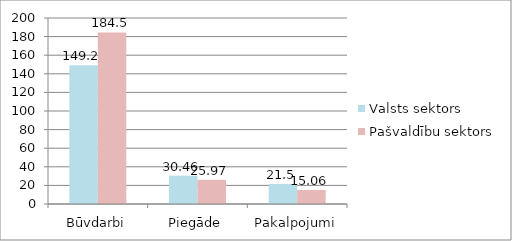
| Category | Valsts sektors | Pašvaldību sektors |
|---|---|---|
| Būvdarbi | 149.2 | 184.5 |
| Piegāde | 30.46 | 25.97 |
| Pakalpojumi | 21.5 | 15.06 |